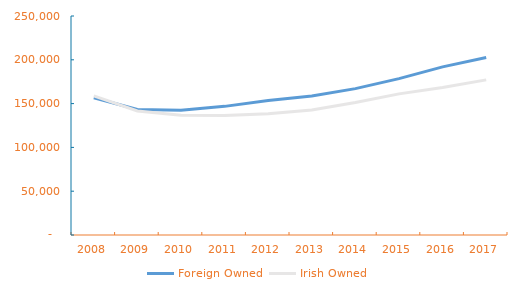
| Category | Foreign Owned | Irish Owned |
|---|---|---|
| 2008.0 | 156718 | 158752 |
| 2009.0 | 143195 | 141623 |
| 2010.0 | 142485 | 136617 |
| 2011.0 | 146846 | 136339 |
| 2012.0 | 153540 | 138431 |
| 2013.0 | 158731 | 142741 |
| 2014.0 | 167101 | 151156 |
| 2015.0 | 178544 | 161088 |
| 2016.0 | 191964 | 168477 |
| 2017.0 | 202703 | 177107 |